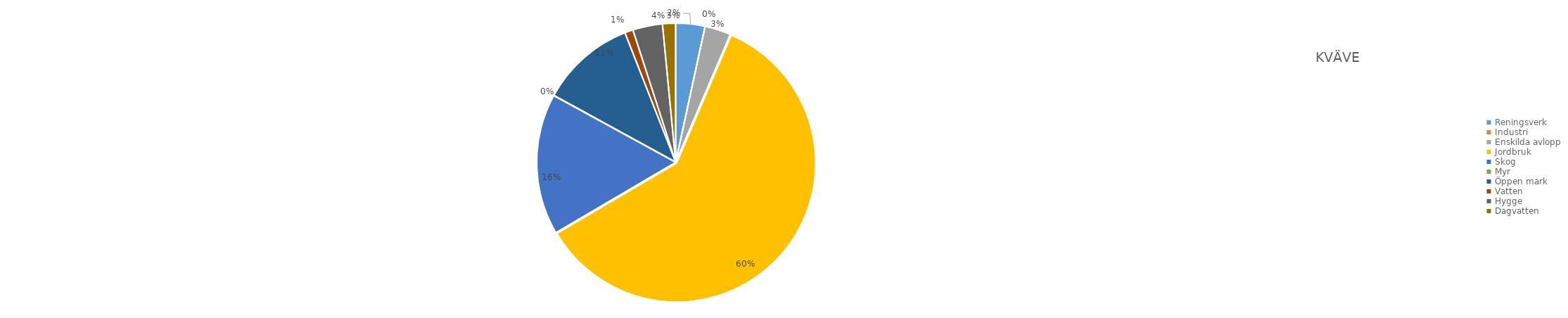
| Category | Series 0 |
|---|---|
| Reningsverk | 10621 |
| Industri | 0 |
| Enskilda avlopp | 9473 |
| Jordbruk | 188094 |
| Skog | 51346 |
| Myr | 126 |
| Öppen mark | 34616 |
| Vatten | 3038 |
| Hygge  | 10821 |
| Dagvatten | 4768 |